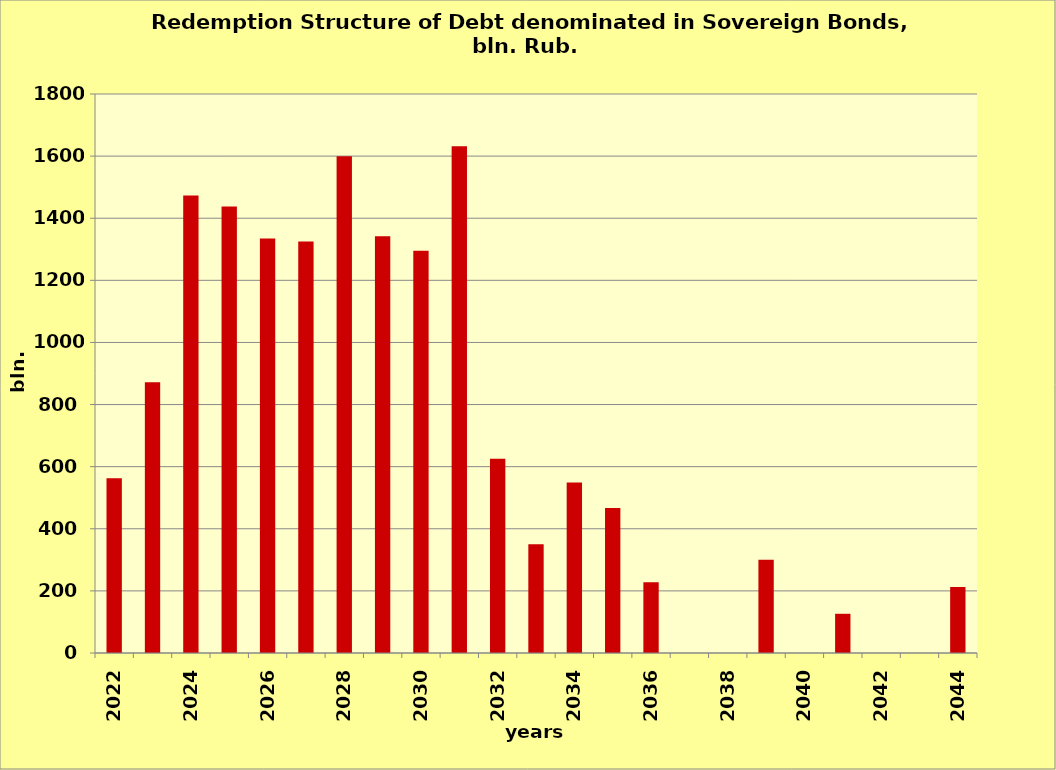
| Category | Series 0 |
|---|---|
| 2022.0 | 562.415 |
| 2023.0 | 871.79 |
| 2024.0 | 1472.853 |
| 2025.0 | 1437.74 |
| 2026.0 | 1334.561 |
| 2027.0 | 1324.833 |
| 2028.0 | 1599.316 |
| 2029.0 | 1342.272 |
| 2030.0 | 1295.452 |
| 2031.0 | 1631.903 |
| 2032.0 | 625.104 |
| 2033.0 | 350 |
| 2034.0 | 548.84 |
| 2035.0 | 467.105 |
| 2036.0 | 227.812 |
| 2037.0 | 0 |
| 2038.0 | 0 |
| 2039.0 | 300 |
| 2040.0 | 0 |
| 2041.0 | 126.269 |
| 2042.0 | 0 |
| 2043.0 | 0 |
| 2044.0 | 212.636 |